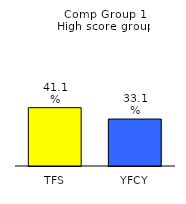
| Category | Series 0 |
|---|---|
| TFS | 0.411 |
| YFCY | 0.331 |